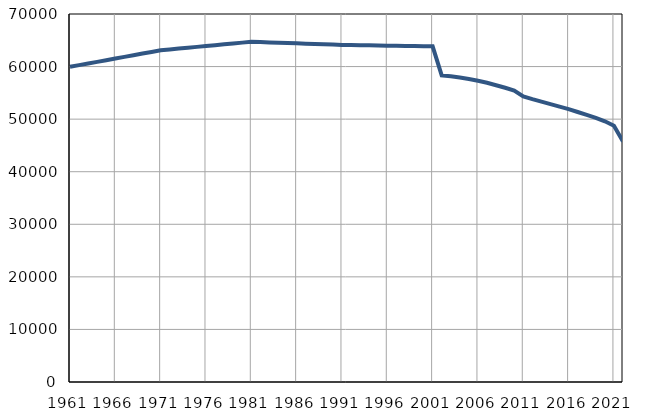
| Category | Број
становника |
|---|---|
| 1961.0 | 59957 |
| 1962.0 | 60271 |
| 1963.0 | 60585 |
| 1964.0 | 60899 |
| 1965.0 | 61213 |
| 1966.0 | 61527 |
| 1967.0 | 61841 |
| 1968.0 | 62155 |
| 1969.0 | 62469 |
| 1970.0 | 62783 |
| 1971.0 | 63097 |
| 1972.0 | 63259 |
| 1973.0 | 63421 |
| 1974.0 | 63583 |
| 1975.0 | 63745 |
| 1976.0 | 63907 |
| 1977.0 | 64070 |
| 1978.0 | 64232 |
| 1979.0 | 64393 |
| 1980.0 | 64556 |
| 1981.0 | 64718 |
| 1982.0 | 64658 |
| 1983.0 | 64598 |
| 1984.0 | 64538 |
| 1985.0 | 64478 |
| 1986.0 | 64418 |
| 1987.0 | 64359 |
| 1988.0 | 64299 |
| 1989.0 | 64239 |
| 1990.0 | 64179 |
| 1991.0 | 64119 |
| 1992.0 | 64092 |
| 1993.0 | 64065 |
| 1994.0 | 64037 |
| 1995.0 | 64010 |
| 1996.0 | 63983 |
| 1997.0 | 63955 |
| 1998.0 | 63929 |
| 1999.0 | 63901 |
| 2000.0 | 63874 |
| 2001.0 | 63847 |
| 2002.0 | 58316 |
| 2003.0 | 58140 |
| 2004.0 | 57926 |
| 2005.0 | 57633 |
| 2006.0 | 57306 |
| 2007.0 | 56913 |
| 2008.0 | 56448 |
| 2009.0 | 55973 |
| 2010.0 | 55454 |
| 2011.0 | 54335 |
| 2012.0 | 53801 |
| 2013.0 | 53327 |
| 2014.0 | 52860 |
| 2015.0 | 52384 |
| 2016.0 | 51921 |
| 2017.0 | 51356 |
| 2018.0 | 50798 |
| 2019.0 | 50262 |
| 2020.0 | 49596 |
| 2021.0 | 48756 |
| 2022.0 | 45746 |